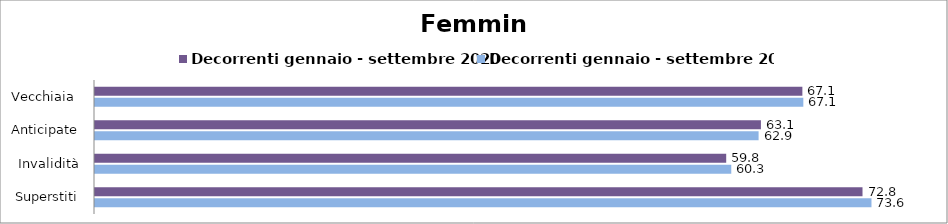
| Category | Decorrenti gennaio - settembre 2020 | Decorrenti gennaio - settembre 2021 |
|---|---|---|
| Vecchiaia  | 67.05 | 67.14 |
| Anticipate | 63.12 | 62.9 |
| Invalidità | 59.83 | 60.31 |
| Superstiti | 72.75 | 73.6 |